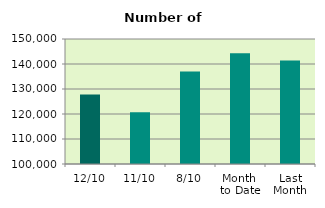
| Category | Series 0 |
|---|---|
| 12/10 | 127850 |
| 11/10 | 120696 |
| 8/10 | 136978 |
| Month 
to Date | 144255.75 |
| Last
Month | 141428.727 |